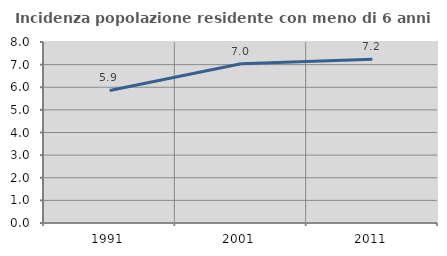
| Category | Incidenza popolazione residente con meno di 6 anni |
|---|---|
| 1991.0 | 5.857 |
| 2001.0 | 7.038 |
| 2011.0 | 7.236 |